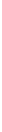
| Category | MP |
|---|---|
| 31.14 | 3 |
| 33.41 | 0 |
| 36.82 | 1 |
| 33.89 | 2 |
| 33.68 | 0 |
| 34.84 | 1 |